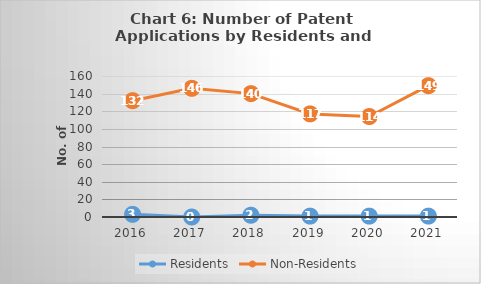
| Category | Residents | Non-Residents |
|---|---|---|
| 2016.0 | 3 | 132 |
| 2017.0 | 0 | 146 |
| 2018.0 | 2 | 140 |
| 2019.0 | 1 | 117 |
| 2020.0 | 1 | 114 |
| 2021.0 | 1 | 149 |